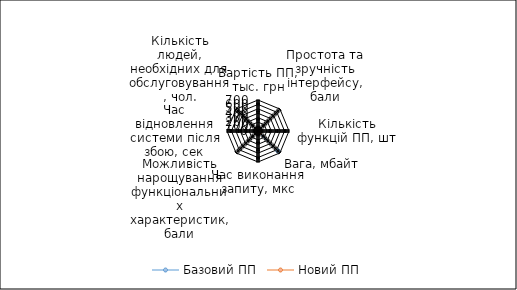
| Category | Базовий ПП | Новий ПП |
|---|---|---|
| Вартість ПП, тыс. грн | 29.5 | 28.6 |
| Простота та зручність інтерфейсу, бали | 4 | 5 |
| Кількість функцій ПП, шт | 4 | 3 |
| Вага, мбайт | 633 | 50 |
| Час виконання запиту, мкс | 16 | 14 |
| Можливість нарощування функціональних характеристик, бали | 3 | 4 |
| Час відновлення системи після збою, сек | 30 | 30 |
| Кiлькiсть людей, необхiдних для обслуговування, чол. | 1 | 1 |